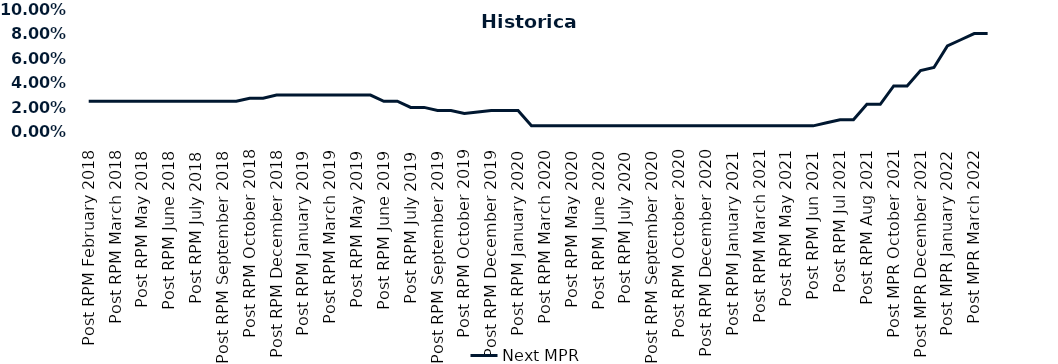
| Category | Next MPR |
|---|---|
| Post RPM February 2018 | 0.025 |
| Pre RPM March 2018 | 0.025 |
| Post RPM March 2018 | 0.025 |
| Pre RPM May 2018 | 0.025 |
| Post RPM May 2018 | 0.025 |
| Pre RPM June 2018 | 0.025 |
| Post RPM June 2018 | 0.025 |
| Pre RPM July 2018 | 0.025 |
| Post RPM July 2018 | 0.025 |
| Pre RPM September 2018 | 0.025 |
| Post RPM September 2018 | 0.025 |
| Pre RPM October 2018 | 0.025 |
| Post RPM October 2018 | 0.028 |
| Pre RPM December 2018 | 0.028 |
| Post RPM December 2018 | 0.03 |
| Pre RPM January 2019 | 0.03 |
| Post RPM January 2019 | 0.03 |
| Pre RPM March 2019 | 0.03 |
| Post RPM March 2019 | 0.03 |
| Pre RPM May 2019 | 0.03 |
| Post RPM May 2019 | 0.03 |
| Pre RPM June 2019 | 0.03 |
| Post RPM June 2019 | 0.025 |
| Pre RPM July 2019 | 0.025 |
| Post RPM July 2019 | 0.02 |
| Pre RPM September 2019 | 0.02 |
| Post RPM September 2019 | 0.018 |
| Pre RPM October 2019 | 0.018 |
| Post RPM October 2019 | 0.015 |
| Pre RPM December 2019 | 0.016 |
| Post RPM December 2019 | 0.018 |
| Pre RPM January 2020 | 0.018 |
| Post RPM January 2020 | 0.018 |
| Pre RPM March 2020 | 0.005 |
| Post RPM March 2020 | 0.005 |
| Pre RPM May 2020 | 0.005 |
| Post RPM May 2020 | 0.005 |
| Pre RPM June 2020 | 0.005 |
| Post RPM June 2020 | 0.005 |
| Pre RPM July 2020 | 0.005 |
| Post RPM July 2020 | 0.005 |
| Pre RPM September 2020 | 0.005 |
| Post RPM September 2020 | 0.005 |
| Pre RPM October 2020 | 0.005 |
| Post RPM October 2020 | 0.005 |
| Pre RPM December 2020 | 0.005 |
|  Post RPM December 2020 | 0.005 |
| Pre RPM January 2021 | 0.005 |
| Post RPM January 2021 | 0.005 |
|  Pre RPM March 2021 | 0.005 |
|  Post RPM March 2021 | 0.005 |
|  Pre RPM May 2021 | 0.005 |
|  Post RPM May 2021 | 0.005 |
|  Pre RPM Jun 2021 | 0.005 |
|   Post RPM Jun 2021 | 0.005 |
| Pre RPM Jul 2021 | 0.008 |
|  Post RPM Jul 2021 | 0.01 |
| Pre RPM Aug 2021 | 0.01 |
|  Post RPM Aug 2021 | 0.022 |
| Pre MPR October 2021 | 0.022 |
| Post MPR October 2021 | 0.038 |
| Pre MPR December 2021 | 0.038 |
| Post MPR December 2021 | 0.05 |
| Pre MPR January 2022 | 0.052 |
| Post MPR January 2022 | 0.07 |
| Pre MPR March 2022 | 0.075 |
| Post MPR March 2022 | 0.08 |
| Pre MPR May 2022 | 0.08 |